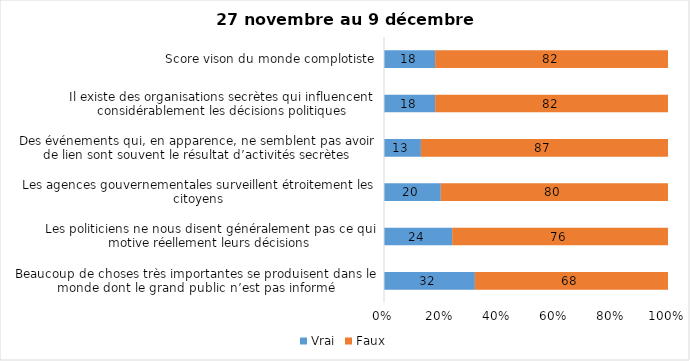
| Category | Vrai | Faux |
|---|---|---|
| Beaucoup de choses très importantes se produisent dans le monde dont le grand public n’est pas informé | 32 | 68 |
| Les politiciens ne nous disent généralement pas ce qui motive réellement leurs décisions | 24 | 76 |
| Les agences gouvernementales surveillent étroitement les citoyens | 20 | 80 |
| Des événements qui, en apparence, ne semblent pas avoir de lien sont souvent le résultat d’activités secrètes | 13 | 87 |
| Il existe des organisations secrètes qui influencent considérablement les décisions politiques | 18 | 82 |
| Score vison du monde complotiste | 18 | 82 |